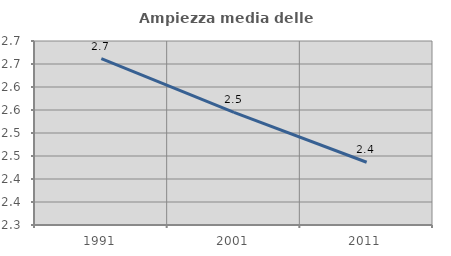
| Category | Ampiezza media delle famiglie |
|---|---|
| 1991.0 | 2.662 |
| 2001.0 | 2.545 |
| 2011.0 | 2.436 |